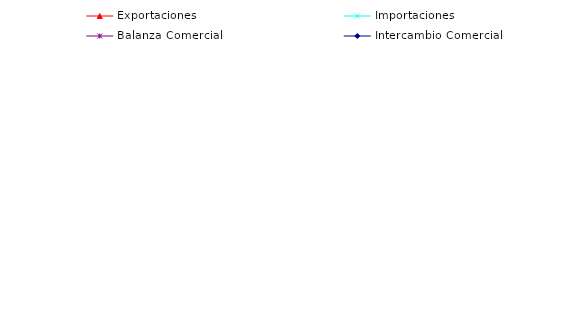
| Category | Exportaciones | Importaciones | Balanza Comercial | Intercambio Comercial |
|---|---|---|---|---|
| 2002.0 | 50.728 | 93.969 | -43.241 | 144.697 |
| 2003.0 | 56.378 | 103.386 | -47.008 | 159.764 |
| 2004.0 | 138.21 | 116.803 | 21.407 | 255.013 |
| 2005.0 | 130.734 | 158.338 | -27.604 | 289.073 |
| 2006.0 | 405.952 | 272.467 | 133.485 | 678.419 |
| 2007.0 | 292.869 | 374.055 | -81.185 | 666.924 |
| 2008.0 | 160.353 | 393.842 | -233.489 | 554.195 |
| 2009.0 | 133.395 | 194.676 | -61.281 | 328.071 |
| 2010.0 | 281.572 | 565.139 | -283.567 | 846.711 |
| 2011.0 | 330.95 | 618.41 | -287.46 | 949.36 |
| 2012.0 | 313.34 | 686.23 | -372.89 | 999.57 |
| 2013.0 | 244.45 | 729.24 | -484.79 | 973.69 |